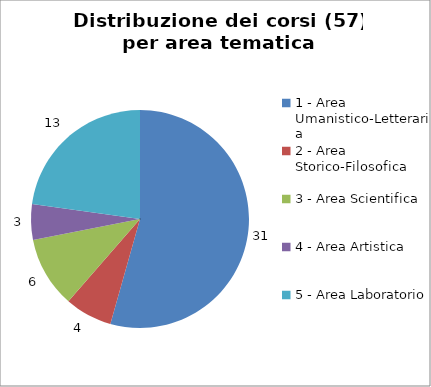
| Category | Nr. Corsi |
|---|---|
| 1 - Area Umanistico-Letteraria | 31 |
| 2 - Area Storico-Filosofica | 4 |
| 3 - Area Scientifica | 6 |
| 4 - Area Artistica | 3 |
| 5 - Area Laboratorio | 13 |